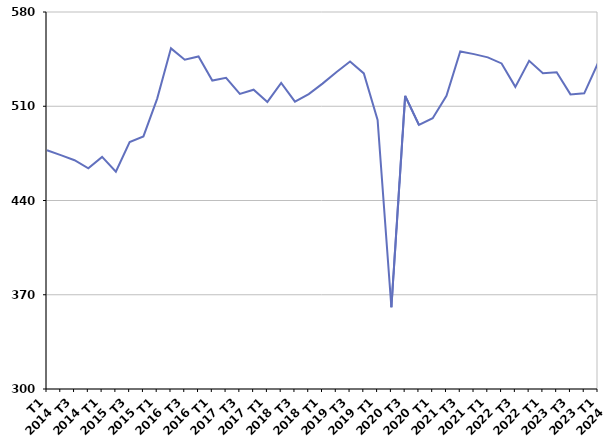
| Category | Ensemble des sorties de catégories A, B, C |
|---|---|
| T1
2014 | 477.3 |
| T2
2014 | 473.7 |
| T3
2014 | 469.9 |
| T4
2014 | 463.9 |
| T1
2015 | 472.4 |
| T2
2015 | 461.4 |
| T3
2015 | 483.4 |
| T4
2015 | 487.6 |
| T1
2016 | 515.7 |
| T2
2016 | 553 |
| T3
2016 | 544.6 |
| T4
2016 | 547 |
| T1
2017 | 529.1 |
| T2
2017 | 531.1 |
| T3
2017 | 519.2 |
| T4
2017 | 522.3 |
| T1
2018 | 513.2 |
| T2
2018 | 527.3 |
| T3
2018 | 513.4 |
| T4
2018 | 519 |
| T1
2019 | 526.8 |
| T2
2019 | 535.3 |
| T3
2019 | 543.2 |
| T4
2019 | 534.4 |
| T1
2020 | 499.8 |
| T2
2020 | 360.7 |
| T3
2020 | 517.7 |
| T4
2020 | 496.2 |
| T1
2021 | 501.1 |
| T2
2021 | 517.8 |
| T3
2021 | 550.7 |
| T4
2021 | 548.7 |
| T1
2022 | 546.3 |
| T2
2022 | 541.8 |
| T3
2022 | 524.4 |
| T4
2022 | 543.7 |
| T1
2023 | 534.5 |
| T2
2023 | 535.2 |
| T3
2023 | 518.8 |
| T4
2023 | 519.6 |
| T1
2024 | 542.1 |